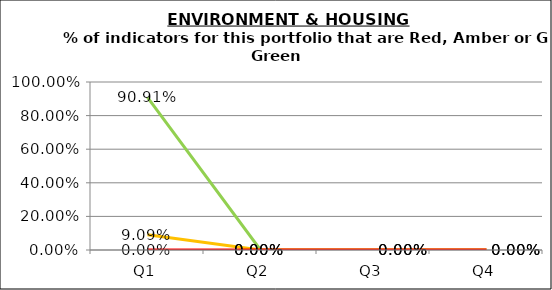
| Category | Green | Amber | Red |
|---|---|---|---|
| Q1 | 0.909 | 0.091 | 0 |
| Q2 | 0 | 0 | 0 |
| Q3 | 0 | 0 | 0 |
| Q4 | 0 | 0 | 0 |